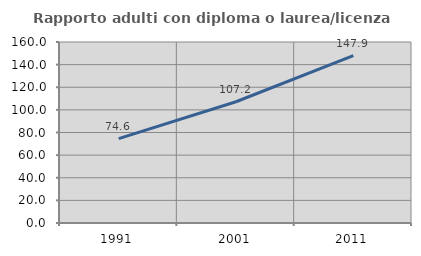
| Category | Rapporto adulti con diploma o laurea/licenza media  |
|---|---|
| 1991.0 | 74.633 |
| 2001.0 | 107.174 |
| 2011.0 | 147.914 |